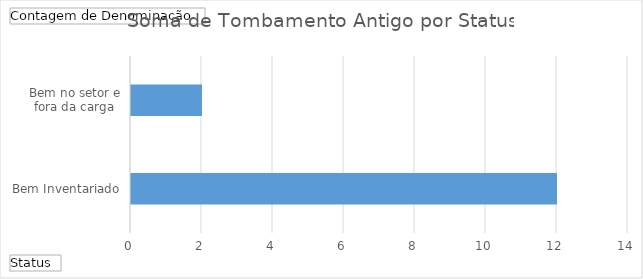
| Category | Total |
|---|---|
| Bem Inventariado | 12 |
| Bem no setor e fora da carga | 2 |